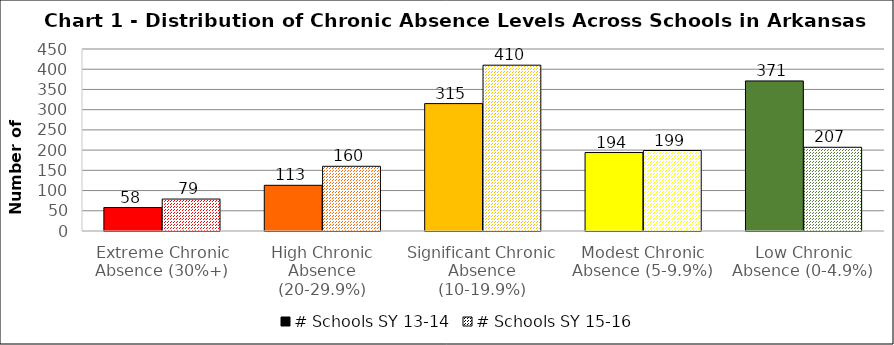
| Category | # Schools SY 13-14 | # Schools SY 15-16 |
|---|---|---|
| Extreme Chronic Absence (30%+) | 58 | 79 |
| High Chronic Absence (20-29.9%) | 113 | 160 |
| Significant Chronic Absence (10-19.9%) | 315 | 410 |
| Modest Chronic Absence (5-9.9%) | 194 | 199 |
| Low Chronic Absence (0-4.9%) | 371 | 207 |